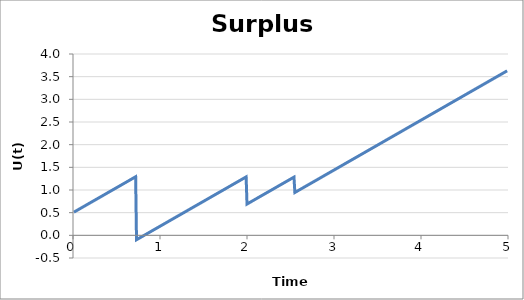
| Category | Surplus Process |
|---|---|
| 0.01 | 0.511 |
| 0.02 | 0.522 |
| 0.03 | 0.533 |
| 0.04 | 0.544 |
| 0.05 | 0.555 |
| 0.06 | 0.566 |
| 0.07 | 0.577 |
| 0.08 | 0.588 |
| 0.09 | 0.599 |
| 0.1 | 0.61 |
| 0.11 | 0.621 |
| 0.12 | 0.632 |
| 0.13 | 0.643 |
| 0.14 | 0.654 |
| 0.15 | 0.665 |
| 0.16 | 0.676 |
| 0.19 | 0.709 |
| 0.2 | 0.72 |
| 0.21 | 0.731 |
| 0.22 | 0.742 |
| 0.23 | 0.753 |
| 0.24 | 0.764 |
| 0.25 | 0.775 |
| 0.26 | 0.786 |
| 0.27 | 0.797 |
| 0.28 | 0.808 |
| 0.29 | 0.819 |
| 0.3 | 0.83 |
| 0.31 | 0.841 |
| 0.32 | 0.852 |
| 0.33 | 0.863 |
| 0.34 | 0.874 |
| 0.35 | 0.885 |
| 0.36 | 0.896 |
| 0.37 | 0.907 |
| 0.38 | 0.918 |
| 0.39 | 0.929 |
| 0.4 | 0.94 |
| 0.41 | 0.951 |
| 0.42 | 0.962 |
| 0.43 | 0.973 |
| 0.44 | 0.984 |
| 0.45 | 0.995 |
| 0.46 | 1.006 |
| 0.47 | 1.017 |
| 0.48 | 1.028 |
| 0.49 | 1.039 |
| 0.5 | 1.05 |
| 0.54 | 1.094 |
| 0.55 | 1.105 |
| 0.56 | 1.116 |
| 0.57 | 1.127 |
| 0.58 | 1.138 |
| 0.59 | 1.149 |
| 0.6 | 1.16 |
| 0.61 | 1.171 |
| 0.62 | 1.182 |
| 0.63 | 1.193 |
| 0.64 | 1.204 |
| 0.65 | 1.215 |
| 0.66 | 1.226 |
| 0.67 | 1.237 |
| 0.68 | 1.248 |
| 0.69 | 1.259 |
| 0.7 | 1.27 |
| 0.71 | 1.281 |
| 0.72 | 1.292 |
| 0.73 | -0.097 |
| 0.74 | -0.086 |
| 0.75 | -0.075 |
| 0.76 | -0.064 |
| 0.77 | -0.053 |
| 0.78 | -0.042 |
| 0.79 | -0.031 |
| 0.8 | -0.02 |
| 0.81 | -0.009 |
| 0.82 | 0.002 |
| 0.83 | 0.013 |
| 0.84 | 0.024 |
| 0.85 | 0.035 |
| 0.86 | 0.046 |
| 0.87 | 0.057 |
| 0.88 | 0.068 |
| 0.89 | 0.079 |
| 0.9 | 0.09 |
| 0.91 | 0.101 |
| 0.92 | 0.112 |
| 0.93 | 0.123 |
| 0.94 | 0.134 |
| 0.95 | 0.145 |
| 0.96 | 0.156 |
| 0.97 | 0.167 |
| 0.98 | 0.178 |
| 0.99 | 0.189 |
| 1.0 | 0.2 |
| 1.01 | 0.211 |
| 1.02 | 0.222 |
| 1.03 | 0.233 |
| 1.04 | 0.244 |
| 1.05 | 0.255 |
| 1.06 | 0.266 |
| 1.07 | 0.277 |
| 1.08 | 0.288 |
| 1.09 | 0.299 |
| 1.1 | 0.31 |
| 1.11 | 0.321 |
| 1.12 | 0.332 |
| 1.13 | 0.343 |
| 1.14 | 0.354 |
| 1.15 | 0.365 |
| 1.16 | 0.376 |
| 1.17 | 0.387 |
| 1.18 | 0.398 |
| 1.19 | 0.409 |
| 1.2 | 0.42 |
| 1.21 | 0.431 |
| 1.22 | 0.442 |
| 1.23 | 0.453 |
| 1.24 | 0.464 |
| 1.25 | 0.475 |
| 1.26 | 0.486 |
| 1.27 | 0.497 |
| 1.28 | 0.508 |
| 1.29 | 0.519 |
| 1.3 | 0.53 |
| 1.31 | 0.541 |
| 1.32 | 0.552 |
| 1.33 | 0.563 |
| 1.34 | 0.574 |
| 1.35 | 0.585 |
| 1.36 | 0.596 |
| 1.37 | 0.607 |
| 1.38 | 0.618 |
| 1.39 | 0.629 |
| 1.4 | 0.64 |
| 1.41 | 0.651 |
| 1.42 | 0.662 |
| 1.43 | 0.673 |
| 1.44 | 0.684 |
| 1.45 | 0.695 |
| 1.46 | 0.706 |
| 1.47 | 0.717 |
| 1.48 | 0.728 |
| 1.49 | 0.739 |
| 1.5 | 0.75 |
| 1.51 | 0.761 |
| 1.52 | 0.772 |
| 1.53 | 0.783 |
| 1.54 | 0.794 |
| 1.55 | 0.805 |
| 1.56 | 0.816 |
| 1.57 | 0.827 |
| 1.58 | 0.838 |
| 1.59 | 0.849 |
| 1.6 | 0.86 |
| 1.61 | 0.871 |
| 1.62 | 0.882 |
| 1.63 | 0.893 |
| 1.64 | 0.904 |
| 1.65 | 0.915 |
| 1.66 | 0.926 |
| 1.67 | 0.937 |
| 1.68 | 0.948 |
| 1.69 | 0.959 |
| 1.7 | 0.97 |
| 1.71 | 0.981 |
| 1.72 | 0.992 |
| 1.73 | 1.003 |
| 1.74 | 1.014 |
| 1.75 | 1.025 |
| 1.76 | 1.036 |
| 1.77 | 1.047 |
| 1.78 | 1.058 |
| 1.79 | 1.069 |
| 1.8 | 1.08 |
| 1.81 | 1.091 |
| 1.82 | 1.102 |
| 1.83 | 1.113 |
| 1.84 | 1.124 |
| 1.85 | 1.135 |
| 1.86 | 1.146 |
| 1.87 | 1.157 |
| 1.88 | 1.168 |
| 1.89 | 1.179 |
| 1.9 | 1.19 |
| 1.91 | 1.201 |
| 1.92 | 1.212 |
| 1.93 | 1.223 |
| 1.94 | 1.234 |
| 1.95 | 1.245 |
| 1.96 | 1.256 |
| 1.97 | 1.267 |
| 1.98 | 1.278 |
| 1.99 | 1.289 |
| 2.0 | 0.69 |
| 2.01 | 0.701 |
| 2.02 | 0.712 |
| 2.03 | 0.723 |
| 2.04 | 0.734 |
| 2.05 | 0.745 |
| 2.06 | 0.756 |
| 2.07 | 0.767 |
| 2.08 | 0.778 |
| 2.09 | 0.789 |
| 2.1 | 0.8 |
| 2.11 | 0.811 |
| 2.12 | 0.822 |
| 2.13 | 0.833 |
| 2.14 | 0.844 |
| 2.15 | 0.855 |
| 2.16 | 0.866 |
| 2.17 | 0.877 |
| 2.18 | 0.888 |
| 2.19 | 0.899 |
| 2.2 | 0.91 |
| 2.21 | 0.921 |
| 2.22 | 0.932 |
| 2.23 | 0.943 |
| 2.24 | 0.954 |
| 2.25 | 0.965 |
| 2.26 | 0.976 |
| 2.27 | 0.987 |
| 2.28 | 0.998 |
| 2.29 | 1.009 |
| 2.3 | 1.02 |
| 2.31 | 1.031 |
| 2.32 | 1.042 |
| 2.33 | 1.053 |
| 2.34 | 1.064 |
| 2.35 | 1.075 |
| 2.36 | 1.086 |
| 2.37 | 1.097 |
| 2.38 | 1.108 |
| 2.39 | 1.119 |
| 2.4 | 1.13 |
| 2.41 | 1.141 |
| 2.42 | 1.152 |
| 2.43 | 1.163 |
| 2.44 | 1.174 |
| 2.45 | 1.185 |
| 2.46 | 1.196 |
| 2.47 | 1.207 |
| 2.48 | 1.218 |
| 2.49 | 1.229 |
| 2.5 | 1.24 |
| 2.51 | 1.251 |
| 2.52 | 1.262 |
| 2.53 | 1.273 |
| 2.54 | 1.284 |
| 2.55 | 0.945 |
| 2.56 | 0.956 |
| 2.57 | 0.967 |
| 2.58 | 0.978 |
| 2.59 | 0.989 |
| 2.6 | 1 |
| 2.61 | 1.011 |
| 2.62 | 1.022 |
| 2.63 | 1.033 |
| 2.64 | 1.044 |
| 2.65 | 1.055 |
| 2.66 | 1.066 |
| 2.67 | 1.077 |
| 2.68 | 1.088 |
| 2.69 | 1.099 |
| 2.7 | 1.11 |
| 2.71 | 1.121 |
| 2.72 | 1.132 |
| 2.73 | 1.143 |
| 2.74 | 1.154 |
| 2.75 | 1.165 |
| 2.76 | 1.176 |
| 2.77 | 1.187 |
| 2.78 | 1.198 |
| 2.79 | 1.209 |
| 2.8 | 1.22 |
| 2.81 | 1.231 |
| 2.82 | 1.242 |
| 2.83 | 1.253 |
| 2.84 | 1.264 |
| 2.85 | 1.275 |
| 2.86 | 1.286 |
| 2.87 | 1.297 |
| 2.88 | 1.308 |
| 2.89 | 1.319 |
| 2.9 | 1.33 |
| 2.91 | 1.341 |
| 2.92 | 1.352 |
| 2.93 | 1.363 |
| 2.94 | 1.374 |
| 2.95 | 1.385 |
| 2.96 | 1.396 |
| 2.97 | 1.407 |
| 2.98 | 1.418 |
| 2.99 | 1.429 |
| 3.0 | 1.44 |
| 3.01 | 1.451 |
| 3.02 | 1.462 |
| 3.03 | 1.473 |
| 3.04 | 1.484 |
| 3.05 | 1.495 |
| 3.06 | 1.506 |
| 3.07 | 1.517 |
| 3.08 | 1.528 |
| 3.09 | 1.539 |
| 3.1 | 1.55 |
| 3.11 | 1.561 |
| 3.12 | 1.572 |
| 3.13 | 1.583 |
| 3.14 | 1.594 |
| 3.15 | 1.605 |
| 3.16 | 1.616 |
| 3.17 | 1.627 |
| 3.18 | 1.638 |
| 3.19 | 1.649 |
| 3.2 | 1.66 |
| 3.21 | 1.671 |
| 3.22 | 1.682 |
| 3.23 | 1.693 |
| 3.24 | 1.704 |
| 3.25 | 1.715 |
| 3.26 | 1.726 |
| 3.27 | 1.737 |
| 3.28 | 1.748 |
| 3.29 | 1.759 |
| 3.3 | 1.77 |
| 3.31 | 1.781 |
| 3.32 | 1.792 |
| 3.33 | 1.803 |
| 3.34 | 1.814 |
| 3.35 | 1.825 |
| 3.36 | 1.836 |
| 3.37 | 1.847 |
| 3.38 | 1.858 |
| 3.39 | 1.869 |
| 3.4 | 1.88 |
| 3.41 | 1.891 |
| 3.42 | 1.902 |
| 3.43 | 1.913 |
| 3.44 | 1.924 |
| 3.45 | 1.935 |
| 3.46 | 1.946 |
| 3.47 | 1.957 |
| 3.48 | 1.968 |
| 3.49 | 1.979 |
| 3.5 | 1.99 |
| 3.51 | 2.001 |
| 3.52 | 2.012 |
| 3.53 | 2.023 |
| 3.54 | 2.034 |
| 3.55 | 2.045 |
| 3.56 | 2.056 |
| 3.57 | 2.067 |
| 3.58 | 2.078 |
| 3.59 | 2.089 |
| 3.6 | 2.1 |
| 3.61 | 2.111 |
| 3.62 | 2.122 |
| 3.63 | 2.133 |
| 3.64 | 2.144 |
| 3.65 | 2.155 |
| 3.66 | 2.166 |
| 3.67 | 2.177 |
| 3.68 | 2.188 |
| 3.69 | 2.199 |
| 3.7 | 2.21 |
| 3.71 | 2.221 |
| 3.72 | 2.232 |
| 3.73 | 2.243 |
| 3.74 | 2.254 |
| 3.75 | 2.265 |
| 3.76 | 2.276 |
| 3.77 | 2.287 |
| 3.78 | 2.298 |
| 3.79 | 2.309 |
| 3.8 | 2.32 |
| 3.81 | 2.331 |
| 3.82 | 2.342 |
| 3.83 | 2.353 |
| 3.84 | 2.364 |
| 3.85 | 2.375 |
| 3.86 | 2.386 |
| 3.87 | 2.397 |
| 3.88 | 2.408 |
| 3.89 | 2.419 |
| 3.9 | 2.43 |
| 3.91 | 2.441 |
| 3.92 | 2.452 |
| 3.93 | 2.463 |
| 3.94 | 2.474 |
| 3.95 | 2.485 |
| 3.96 | 2.496 |
| 3.97 | 2.507 |
| 3.98 | 2.518 |
| 3.99 | 2.529 |
| 4.0 | 2.54 |
| 4.01 | 2.551 |
| 4.02 | 2.562 |
| 4.03 | 2.573 |
| 4.04 | 2.584 |
| 4.05 | 2.595 |
| 4.06 | 2.606 |
| 4.07 | 2.617 |
| 4.08 | 2.628 |
| 4.09 | 2.639 |
| 4.1 | 2.65 |
| 4.11 | 2.661 |
| 4.12 | 2.672 |
| 4.13 | 2.683 |
| 4.14 | 2.694 |
| 4.15 | 2.705 |
| 4.16 | 2.716 |
| 4.17 | 2.727 |
| 4.18 | 2.738 |
| 4.19 | 2.749 |
| 4.2 | 2.76 |
| 4.21 | 2.771 |
| 4.22 | 2.782 |
| 4.23 | 2.793 |
| 4.24 | 2.804 |
| 4.25 | 2.815 |
| 4.26 | 2.826 |
| 4.27 | 2.837 |
| 4.28 | 2.848 |
| 4.29 | 2.859 |
| 4.3 | 2.87 |
| 4.31 | 2.881 |
| 4.32 | 2.892 |
| 4.33 | 2.903 |
| 4.34 | 2.914 |
| 4.35 | 2.925 |
| 4.36 | 2.936 |
| 4.37 | 2.947 |
| 4.38 | 2.958 |
| 4.39 | 2.969 |
| 4.4 | 2.98 |
| 4.41 | 2.991 |
| 4.42 | 3.002 |
| 4.43 | 3.013 |
| 4.44 | 3.024 |
| 4.45 | 3.035 |
| 4.46 | 3.046 |
| 4.47 | 3.057 |
| 4.48 | 3.068 |
| 4.49 | 3.079 |
| 4.5 | 3.09 |
| 4.51 | 3.101 |
| 4.52 | 3.112 |
| 4.53 | 3.123 |
| 4.54 | 3.134 |
| 4.55 | 3.145 |
| 4.56 | 3.156 |
| 4.57 | 3.167 |
| 4.58 | 3.178 |
| 4.59 | 3.189 |
| 4.6 | 3.2 |
| 4.61 | 3.211 |
| 4.62 | 3.222 |
| 4.63 | 3.233 |
| 4.64 | 3.244 |
| 4.65 | 3.255 |
| 4.66 | 3.266 |
| 4.67 | 3.277 |
| 4.68 | 3.288 |
| 4.69 | 3.299 |
| 4.7 | 3.31 |
| 4.71 | 3.321 |
| 4.72 | 3.332 |
| 4.73 | 3.343 |
| 4.74 | 3.354 |
| 4.75 | 3.365 |
| 4.76 | 3.376 |
| 4.77 | 3.387 |
| 4.78 | 3.398 |
| 4.79 | 3.409 |
| 4.8 | 3.42 |
| 4.81 | 3.431 |
| 4.82 | 3.442 |
| 4.83 | 3.453 |
| 4.84 | 3.464 |
| 4.85 | 3.475 |
| 4.86 | 3.486 |
| 4.87 | 3.497 |
| 4.88 | 3.508 |
| 4.89 | 3.519 |
| 4.9 | 3.53 |
| 4.91 | 3.541 |
| 4.92 | 3.552 |
| 4.93 | 3.563 |
| 4.94 | 3.574 |
| 4.95 | 3.585 |
| 4.96 | 3.596 |
| 4.97 | 3.607 |
| 4.98 | 3.618 |
| 4.99 | 3.629 |
| 5.0 | 3.64 |